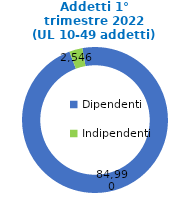
| Category | Series 0 |
|---|---|
| Dipendenti | 84990 |
| Indipendenti | 2546 |